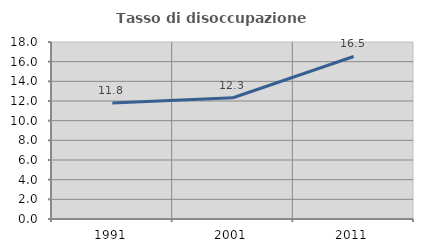
| Category | Tasso di disoccupazione giovanile  |
|---|---|
| 1991.0 | 11.795 |
| 2001.0 | 12.329 |
| 2011.0 | 16.529 |